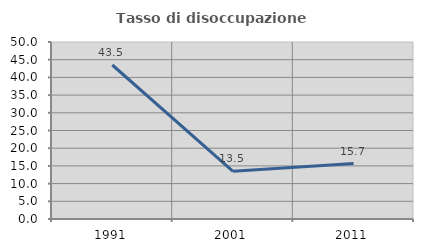
| Category | Tasso di disoccupazione giovanile  |
|---|---|
| 1991.0 | 43.503 |
| 2001.0 | 13.462 |
| 2011.0 | 15.663 |